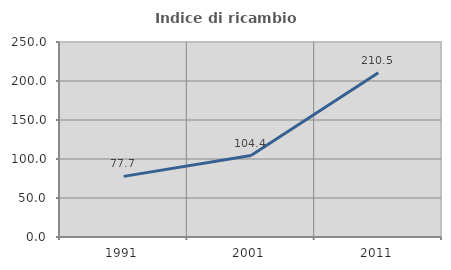
| Category | Indice di ricambio occupazionale  |
|---|---|
| 1991.0 | 77.732 |
| 2001.0 | 104.421 |
| 2011.0 | 210.512 |